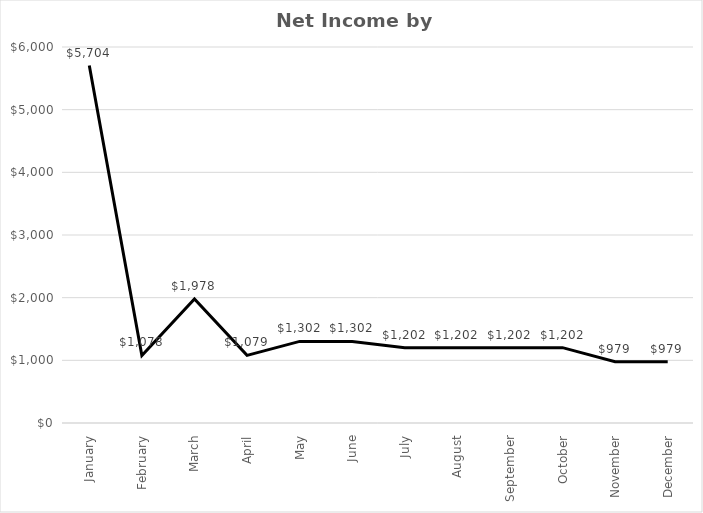
| Category | NET INCOME |
|---|---|
| January | 5704.2 |
| February | 1077.7 |
| March | 1977.7 |
| April | 1079.2 |
| May | 1302.2 |
| June | 1302.2 |
| July | 1202.2 |
| August | 1202.2 |
| September | 1202.2 |
| October | 1202.2 |
| November | 979.2 |
| December | 979.2 |